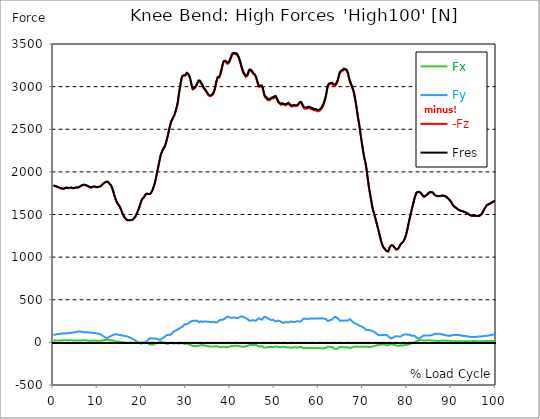
| Category |  Fx |  Fy |  -Fz |  Fres |
|---|---|---|---|---|
| 0.0 | 22.389 | 87.048 | 1838.339 | 1840.763 |
| 0.167348456675344 | 22.09 | 88.895 | 1835.905 | 1838.435 |
| 0.334696913350688 | 21.994 | 90.4 | 1833.695 | 1836.321 |
| 0.5020453700260321 | 22.731 | 91.98 | 1831.431 | 1834.164 |
| 0.669393826701376 | 23.66 | 94.436 | 1827.748 | 1830.577 |
| 0.83674228337672 | 22.891 | 95.995 | 1822.954 | 1825.815 |
| 1.0040907400520642 | 22.357 | 97.308 | 1819.302 | 1822.196 |
| 1.1621420602454444 | 21.919 | 98.504 | 1816.121 | 1819.067 |
| 1.3294905169207885 | 22.165 | 99.369 | 1813.622 | 1816.612 |
| 1.4968389735961325 | 22.656 | 99.849 | 1810.206 | 1813.227 |
| 1.6641874302714765 | 22.389 | 100.554 | 1805.348 | 1808.433 |
| 1.8315358869468206 | 24.407 | 101.291 | 1805.657 | 1808.818 |
| 1.9988843436221646 | 25.881 | 102.914 | 1804.035 | 1807.323 |
| 2.1662328002975086 | 24.813 | 104.942 | 1801.013 | 1804.408 |
| 2.333581256972853 | 23.233 | 106.693 | 1798.643 | 1802.113 |
| 2.5009297136481967 | 23.371 | 107.024 | 1802.732 | 1806.234 |
| 2.6682781703235405 | 25.816 | 104.921 | 1809.821 | 1813.238 |
| 2.8356266269988843 | 27.258 | 104.771 | 1813.206 | 1816.623 |
| 3.002975083674229 | 27.183 | 105.818 | 1812.854 | 1816.324 |
| 3.1703235403495724 | 26.276 | 106.373 | 1810.761 | 1814.231 |
| 3.337671997024917 | 23.948 | 107.59 | 1808.476 | 1811.967 |
| 3.4957233172182973 | 22.347 | 108.914 | 1807.643 | 1811.209 |
| 3.663071773893641 | 22.774 | 109.757 | 1810.259 | 1813.868 |
| 3.8304202305689854 | 24.877 | 110.238 | 1813.313 | 1816.964 |
| 3.997768687244329 | 25.763 | 111.989 | 1813.804 | 1817.541 |
| 4.165117143919673 | 25.304 | 113.484 | 1811.338 | 1815.16 |
| 4.332465600595017 | 23.745 | 114.167 | 1808.199 | 1812.042 |
| 4.499814057270361 | 21.759 | 116.292 | 1806.661 | 1810.611 |
| 4.667162513945706 | 21.161 | 117.744 | 1806.843 | 1810.868 |
| 4.834510970621049 | 21.087 | 118.939 | 1808.156 | 1812.234 |
| 5.001859427296393 | 21.919 | 119.729 | 1811.391 | 1815.501 |
| 5.169207883971737 | 23.243 | 122.078 | 1814.37 | 1818.651 |
| 5.336556340647081 | 23.852 | 124.491 | 1816.473 | 1820.904 |
| 5.503904797322425 | 22.571 | 126.947 | 1815.341 | 1819.932 |
| 5.671253253997769 | 20.724 | 129.018 | 1814.583 | 1819.292 |
| 5.82930457419115 | 19.656 | 129.968 | 1816.9 | 1821.673 |
| 5.996653030866494 | 20.692 | 128.805 | 1824.651 | 1829.339 |
| 6.164001487541838 | 22.464 | 126.071 | 1832.905 | 1837.389 |
| 6.331349944217181 | 23.254 | 124.715 | 1836.812 | 1841.2 |
| 6.498698400892526 | 23.094 | 124.427 | 1838.094 | 1842.46 |
| 6.66604685756787 | 24.461 | 122.046 | 1843.517 | 1847.735 |
| 6.833395314243213 | 25.176 | 120.231 | 1845.973 | 1850.062 |
| 7.000743770918558 | 24.247 | 118.181 | 1846.902 | 1850.852 |
| 7.168092227593902 | 23.884 | 117.776 | 1843.411 | 1847.34 |
| 7.335440684269246 | 24.108 | 117.519 | 1841.403 | 1845.332 |
| 7.50278914094459 | 23.756 | 117.349 | 1839.193 | 1843.112 |
| 7.6701375976199335 | 21.951 | 118.726 | 1834.164 | 1838.158 |
| 7.837486054295278 | 20.798 | 118.299 | 1830.235 | 1834.196 |
| 7.995537374488658 | 19.923 | 116.943 | 1825.623 | 1829.488 |
| 8.162885831164003 | 18.802 | 116.494 | 1820.295 | 1824.128 |
| 8.330234287839346 | 18.289 | 115.416 | 1817.242 | 1821.011 |
| 8.49758274451469 | 18.257 | 114.402 | 1815.373 | 1819.078 |
| 8.664931201190035 | 18.759 | 113.067 | 1817.135 | 1820.754 |
| 8.832279657865378 | 20.222 | 111.53 | 1821.278 | 1824.822 |
| 8.999628114540721 | 21.77 | 110.014 | 1824.491 | 1827.951 |
| 9.166976571216066 | 21.866 | 109.565 | 1825.698 | 1829.125 |
| 9.334325027891412 | 21.802 | 109.085 | 1826.242 | 1829.638 |
| 9.501673484566755 | 20.82 | 108.529 | 1823.733 | 1827.107 |
| 9.669021941242098 | 18.866 | 108.166 | 1819.409 | 1822.751 |
| 9.836370397917442 | 18.012 | 105.689 | 1819.366 | 1822.548 |
| 10.003718854592787 | 18.375 | 102.743 | 1820.231 | 1823.242 |
| 10.17106731126813 | 19.197 | 100.735 | 1822.185 | 1825.1 |
| 10.329118631461512 | 19.891 | 99.358 | 1824.598 | 1827.427 |
| 10.496467088136853 | 19.699 | 98.141 | 1823.167 | 1825.943 |
| 10.663815544812199 | 19.987 | 94.308 | 1828.217 | 1830.791 |
| 10.831164001487544 | 21.087 | 88.617 | 1838.777 | 1841.083 |
| 10.998512458162887 | 22.891 | 83.556 | 1847.446 | 1849.518 |
| 11.16586091483823 | 24.428 | 78.613 | 1853.884 | 1855.753 |
| 11.333209371513574 | 25.752 | 70.435 | 1863.451 | 1865.02 |
| 11.50055782818892 | 27.728 | 62.534 | 1873.145 | 1874.437 |
| 11.667906284864264 | 28.315 | 58.37 | 1876.199 | 1877.352 |
| 11.835254741539607 | 27.813 | 54.761 | 1879.231 | 1880.288 |
| 12.00260319821495 | 28.464 | 51.793 | 1883.801 | 1884.783 |
| 12.169951654890292 | 29.713 | 51.911 | 1885.221 | 1886.224 |
| 12.337300111565641 | 30.781 | 53.992 | 1882.765 | 1883.844 |
| 12.504648568240984 | 29.874 | 59.63 | 1873.412 | 1874.64 |
| 12.662699888434362 | 26.938 | 67.338 | 1860.888 | 1862.34 |
| 12.830048345109708 | 24.386 | 72.752 | 1849.71 | 1851.322 |
| 12.997396801785053 | 25.923 | 72.666 | 1843.432 | 1845.076 |
| 13.164745258460396 | 25.592 | 77.182 | 1826.84 | 1828.687 |
| 13.33209371513574 | 22.731 | 84.069 | 1803.234 | 1805.38 |
| 13.499442171811083 | 19.549 | 88.297 | 1775.88 | 1778.218 |
| 13.666790628486426 | 17.585 | 90.539 | 1744.213 | 1746.679 |
| 13.834139085161771 | 16.57 | 92.429 | 1715.086 | 1717.67 |
| 14.001487541837117 | 15.246 | 93.817 | 1688.512 | 1691.202 |
| 14.16883599851246 | 12.951 | 94.5 | 1665.61 | 1668.365 |
| 14.336184455187803 | 9.513 | 94.639 | 1645.41 | 1648.175 |
| 14.503532911863147 | 8.552 | 91.948 | 1628.989 | 1631.626 |
| 14.670881368538492 | 8.403 | 89.632 | 1616.465 | 1619.006 |
| 14.828932688731873 | 8.04 | 88.062 | 1605.18 | 1607.646 |
| 14.996281145407215 | 7.591 | 86.813 | 1592.004 | 1594.417 |
| 15.163629602082558 | 5.883 | 87.486 | 1571.121 | 1573.608 |
| 15.330978058757903 | 4.495 | 83.855 | 1549.895 | 1552.212 |
| 15.498326515433247 | 3.171 | 81.741 | 1528.905 | 1531.147 |
| 15.665674972108594 | 1.911 | 79.884 | 1507.978 | 1510.167 |
| 15.833023428783937 | 0.673 | 78.122 | 1488.098 | 1490.223 |
| 16.00037188545928 | -0.47 | 76.819 | 1473.118 | 1475.211 |
| 16.167720342134626 | -1.687 | 75.41 | 1459.1 | 1461.16 |
| 16.335068798809967 | -3.203 | 73.542 | 1449.224 | 1451.21 |
| 16.502417255485312 | -4.068 | 71.278 | 1440.928 | 1442.807 |
| 16.669765712160658 | -4.612 | 70.189 | 1435.931 | 1437.789 |
| 16.837114168836 | -4.377 | 68.193 | 1432.472 | 1434.244 |
| 17.004462625511344 | -3.481 | 64.627 | 1430.732 | 1432.333 |
| 17.16251394570472 | -3.139 | 59.406 | 1431.789 | 1433.177 |
| 17.32986240238007 | -2.648 | 54.921 | 1435.152 | 1436.348 |
| 17.497210859055414 | -2.915 | 51.761 | 1433.732 | 1434.81 |
| 17.664559315730756 | -2.723 | 47.907 | 1433.048 | 1433.999 |
| 17.8319077724061 | -3.086 | 44.277 | 1435.184 | 1436.017 |
| 17.999256229081443 | -3.427 | 38.757 | 1441.472 | 1442.188 |
| 18.166604685756788 | -3.449 | 33.418 | 1450.751 | 1451.359 |
| 18.333953142432133 | -3.673 | 28.817 | 1461.107 | 1461.619 |
| 18.501301599107478 | -4.057 | 24.535 | 1472.083 | 1472.51 |
| 18.668650055782823 | -3.139 | 17.083 | 1488.45 | 1488.792 |
| 18.835998512458165 | -2.541 | 9.801 | 1506.035 | 1506.323 |
| 19.00334696913351 | -1.836 | 2.989 | 1526.865 | 1527.164 |
| 19.170695425808855 | -1.537 | -1.004 | 1550.376 | 1550.675 |
| 19.338043882484197 | -3.331 | 0.256 | 1569.22 | 1569.487 |
| 19.496095202677576 | -1.196 | -7.164 | 1596.425 | 1596.606 |
| 19.66344365935292 | -0.224 | -11.563 | 1624.344 | 1624.537 |
| 19.830792116028263 | 0.427 | -14.093 | 1649.969 | 1650.171 |
| 19.998140572703612 | 0.48 | -13.132 | 1671.354 | 1671.557 |
| 20.165489029378953 | -1.602 | -8.755 | 1684.615 | 1684.807 |
| 20.3328374860543 | -4.943 | -2.029 | 1693.647 | 1693.872 |
| 20.500185942729644 | -7.997 | 4.014 | 1702.947 | 1703.235 |
| 20.667534399404985 | -5.787 | 1.431 | 1720.894 | 1721.097 |
| 20.83488285608033 | -4.933 | 2.808 | 1734.614 | 1734.753 |
| 21.002231312755672 | -5.669 | 10.954 | 1740.284 | 1740.486 |
| 21.16957976943102 | -5.584 | 16.346 | 1744.907 | 1745.141 |
| 21.336928226106362 | -8.456 | 24.909 | 1744.084 | 1744.437 |
| 21.504276682781704 | -13.73 | 34.71 | 1739.344 | 1739.899 |
| 21.67162513945705 | -19.154 | 43.027 | 1736.525 | 1737.283 |
| 21.82967645965043 | -23.222 | 47.341 | 1740.219 | 1741.127 |
| 21.997024916325774 | -25.101 | 48.003 | 1749.028 | 1749.989 |
| 22.16437337300112 | -26.308 | 48.344 | 1761.061 | 1762.075 |
| 22.33172182967646 | -25.56 | 46.732 | 1777.898 | 1778.944 |
| 22.499070286351806 | -24.685 | 45.771 | 1797.799 | 1798.888 |
| 22.666418743027148 | -22.432 | 46.978 | 1822.9 | 1824 |
| 22.833767199702496 | -19.731 | 48.216 | 1849.891 | 1850.991 |
| 23.00111565637784 | -16.111 | 46.391 | 1881.954 | 1882.947 |
| 23.168464113053183 | -11.734 | 43.39 | 1921.244 | 1922.056 |
| 23.335812569728528 | -8.531 | 41.447 | 1962.04 | 1962.734 |
| 23.50316102640387 | -5.477 | 40.294 | 2003.541 | 2004.171 |
| 23.670509483079215 | -1.879 | 38.073 | 2045.511 | 2046.035 |
| 23.83785793975456 | 4.58 | 30.279 | 2089.745 | 2090.098 |
| 23.995909259947936 | 5.894 | 31.571 | 2132.367 | 2132.741 |
| 24.163257716623285 | 6.983 | 31.23 | 2173.462 | 2173.814 |
| 24.330606173298627 | 7.057 | 34.518 | 2205.898 | 2206.314 |
| 24.49795462997397 | 5.595 | 41.212 | 2229.408 | 2229.985 |
| 24.665303086649313 | 3.748 | 48.441 | 2249.545 | 2250.345 |
| 24.83265154332466 | 0.972 | 56.235 | 2266.51 | 2267.588 |
| 25.0 | -3.897 | 59.971 | 2275.916 | 2277.112 |
| 25.167348456675345 | -7.89 | 65.918 | 2294.344 | 2295.732 |
| 25.334696913350694 | -11.317 | 73.061 | 2319.317 | 2320.962 |
| 25.502045370026035 | -14.424 | 80.599 | 2349.02 | 2350.899 |
| 25.669393826701377 | -16.229 | 85.863 | 2381.232 | 2383.303 |
| 25.836742283376722 | -15.887 | 87.603 | 2417.181 | 2419.37 |
| 26.004090740052067 | -14.723 | 88.265 | 2454.208 | 2456.461 |
| 26.17143919672741 | -12.257 | 86.77 | 2493.894 | 2496.146 |
| 26.329490516920792 | -9.011 | 87.261 | 2530.419 | 2532.682 |
| 26.49683897359613 | -6.086 | 89.77 | 2564.318 | 2566.613 |
| 26.66418743027148 | -6.865 | 97.191 | 2590.945 | 2593.455 |
| 26.831535886946828 | -9.022 | 107.27 | 2610.377 | 2613.271 |
| 26.998884343622166 | -10.463 | 115.523 | 2626.04 | 2629.126 |
| 27.166232800297514 | -11.488 | 123.157 | 2642.642 | 2645.952 |
| 27.333581256972852 | -12.513 | 130.791 | 2659.245 | 2662.768 |
| 27.5009297136482 | -12.033 | 135.691 | 2684.645 | 2688.328 |
| 27.668278170323543 | -10.848 | 139.396 | 2714.198 | 2717.989 |
| 27.835626626998888 | -9.481 | 142.738 | 2746.186 | 2750.072 |
| 28.002975083674233 | -10.314 | 149.112 | 2778.44 | 2782.626 |
| 28.170323540349575 | -11.595 | 151.546 | 2825.856 | 2830.127 |
| 28.33767199702492 | -14.584 | 157.899 | 2891.508 | 2896.013 |
| 28.50502045370026 | -14.734 | 163.942 | 2948.756 | 2953.444 |
| 28.663071773893645 | -12.364 | 169.686 | 2995.948 | 3000.859 |
| 28.830420230568986 | -10.367 | 174.96 | 3052.909 | 3057.991 |
| 28.99776868724433 | -8.734 | 179.092 | 3098.189 | 3103.41 |
| 29.165117143919673 | -7.944 | 183.555 | 3119.895 | 3125.34 |
| 29.33246560059502 | -8.979 | 190.751 | 3129.386 | 3135.259 |
| 29.499814057270367 | -12.396 | 200.435 | 3128.276 | 3134.767 |
| 29.66716251394571 | -18.738 | 212.649 | 3121.058 | 3128.404 |
| 29.834510970621054 | -18.076 | 214.005 | 3127.593 | 3135.013 |
| 30.00185942729639 | -16.154 | 213.258 | 3142.561 | 3149.886 |
| 30.169207883971744 | -14.414 | 213.269 | 3154.68 | 3161.972 |
| 30.33655634064708 | -14.403 | 216.781 | 3149.384 | 3156.922 |
| 30.50390479732243 | -17.414 | 222.867 | 3142.284 | 3150.291 |
| 30.671253253997772 | -21.492 | 229.07 | 3126.706 | 3135.227 |
| 30.829304574191156 | -25.411 | 234.195 | 3105.417 | 3114.407 |
| 30.996653030866494 | -30.941 | 242.171 | 3073.942 | 3083.775 |
| 31.164001487541842 | -34.369 | 246.794 | 3033.498 | 3043.972 |
| 31.331349944217187 | -37.476 | 250.04 | 2993.343 | 3004.34 |
| 31.498698400892525 | -40.155 | 252.41 | 2967.121 | 2978.459 |
| 31.666046857567874 | -41.896 | 252.954 | 2966.234 | 2977.552 |
| 31.833395314243212 | -41.469 | 251.566 | 2974.274 | 2985.41 |
| 32.00074377091856 | -42.867 | 255.047 | 2983.936 | 2995.329 |
| 32.1680922275939 | -46.113 | 257.033 | 2992.702 | 3004.201 |
| 32.33544068426925 | -46.658 | 255.175 | 3007.927 | 3019.191 |
| 32.50278914094459 | -45.739 | 252.175 | 3028.352 | 3039.264 |
| 32.670137597619934 | -42.963 | 246.933 | 3048.221 | 3058.589 |
| 32.83748605429528 | -38.97 | 241.199 | 3062.913 | 3072.725 |
| 33.004834510970625 | -35.5 | 237.879 | 3068.518 | 3078.01 |
| 33.162885831164004 | -34.518 | 241.957 | 3059.71 | 3069.554 |
| 33.33023428783935 | -34.838 | 246.463 | 3042.936 | 3053.218 |
| 33.497582744514695 | -33.045 | 246.111 | 3027.978 | 3038.271 |
| 33.664931201190036 | -30.226 | 242.491 | 3015.209 | 3025.234 |
| 33.83227965786538 | -31.315 | 243.206 | 2995.788 | 3005.963 |
| 33.99962811454073 | -35.073 | 244.541 | 2978.449 | 2988.848 |
| 34.16697657121607 | -36.237 | 244.306 | 2969.694 | 2980.125 |
| 34.33432502789141 | -38.148 | 244.872 | 2957.01 | 2967.537 |
| 34.50167348456676 | -40.219 | 244.787 | 2943.012 | 2953.593 |
| 34.6690219412421 | -42.077 | 243.836 | 2929.538 | 2940.108 |
| 34.83637039791744 | -43.924 | 242.907 | 2915.968 | 2926.538 |
| 35.00371885459279 | -45.771 | 242.299 | 2899.835 | 2910.459 |
| 35.17106731126814 | -47.031 | 240.932 | 2890.451 | 2900.999 |
| 35.338415767943474 | -47.213 | 239.438 | 2887.877 | 2898.309 |
| 35.49646708813686 | -47.074 | 237.964 | 2888.198 | 2898.512 |
| 35.6638155448122 | -47.063 | 236.213 | 2890.579 | 2900.754 |
| 35.831164001487544 | -47.779 | 238.028 | 2897.209 | 2907.533 |
| 35.998512458162885 | -49.241 | 241.936 | 2902.259 | 2912.904 |
| 36.165860914838234 | -49.562 | 242.149 | 2913.032 | 2923.666 |
| 36.333209371513576 | -47.907 | 238.359 | 2936.275 | 2946.504 |
| 36.50055782818892 | -46.508 | 236.202 | 2966.608 | 2976.559 |
| 36.667906284864266 | -44.49 | 233.362 | 3005.824 | 3015.412 |
| 36.83525474153961 | -44.042 | 231.547 | 3049.15 | 3058.492 |
| 37.002603198214956 | -44.576 | 234.537 | 3078.64 | 3088.11 |
| 37.1699516548903 | -47.448 | 241.797 | 3103.516 | 3113.51 |
| 37.337300111565646 | -50.886 | 249.025 | 3110.328 | 3120.952 |
| 37.50464856824098 | -54.9 | 257.641 | 3104.253 | 3115.72 |
| 37.66269988843437 | -56.993 | 261.336 | 3121.72 | 3133.454 |
| 37.83004834510971 | -57.142 | 262.991 | 3151.295 | 3163.05 |
| 37.99739680178505 | -55.594 | 263.962 | 3186.475 | 3198.145 |
| 38.16474525846039 | -52.252 | 263.77 | 3228.937 | 3240.35 |
| 38.33209371513574 | -51.281 | 264.656 | 3263.903 | 3275.253 |
| 38.49944217181109 | -51.152 | 269.429 | 3286.559 | 3298.208 |
| 38.666790628486424 | -52.06 | 277.34 | 3294.716 | 3307.037 |
| 38.83413908516178 | -54.195 | 283.212 | 3291.353 | 3304.24 |
| 39.001487541837115 | -54.911 | 288.113 | 3291.075 | 3304.411 |
| 39.16883599851246 | -56.939 | 295.651 | 3280.26 | 3294.364 |
| 39.336184455187805 | -58.007 | 301.769 | 3266.861 | 3281.627 |
| 39.503532911863154 | -55.487 | 300.733 | 3271.943 | 3286.549 |
| 39.670881368538495 | -53 | 297.893 | 3277.313 | 3291.588 |
| 39.83822982521384 | -49.69 | 292.608 | 3291.705 | 3305.361 |
| 39.996281145407224 | -47.117 | 290.75 | 3314.415 | 3327.804 |
| 40.163629602082565 | -44.618 | 289.213 | 3337.285 | 3350.428 |
| 40.33097805875791 | -41.992 | 287.686 | 3362.343 | 3375.262 |
| 40.498326515433256 | -41.757 | 290.27 | 3376.928 | 3389.996 |
| 40.6656749721086 | -41.81 | 291.53 | 3382.213 | 3395.366 |
| 40.83302342878393 | -41.234 | 291.551 | 3383.003 | 3396.156 |
| 41.00037188545929 | -39.696 | 289.907 | 3383.27 | 3396.263 |
| 41.16772034213463 | -39.504 | 289.01 | 3380.227 | 3393.156 |
| 41.33506879880997 | -38.682 | 287.526 | 3378.251 | 3391.042 |
| 41.50241725548531 | -38.084 | 286.266 | 3375.379 | 3388.063 |
| 41.66976571216066 | -38.458 | 286.917 | 3366.934 | 3379.725 |
| 41.837114168836 | -40.625 | 291.7 | 3344.353 | 3357.677 |
| 42.004462625511344 | -42.013 | 293.366 | 3321.003 | 3334.583 |
| 42.17181108218669 | -44.277 | 296.836 | 3294.332 | 3308.372 |
| 42.32986240238007 | -47.341 | 301.544 | 3264.277 | 3278.915 |
| 42.497210859055414 | -50.704 | 304.438 | 3231.371 | 3246.457 |
| 42.66455931573076 | -51.857 | 304.619 | 3202.074 | 3217.342 |
| 42.831907772406105 | -50.864 | 301.149 | 3176.45 | 3191.515 |
| 42.999256229081446 | -49.882 | 297.679 | 3150.815 | 3165.677 |
| 43.16660468575679 | -47.64 | 291.7 | 3139.145 | 3153.505 |
| 43.33395314243214 | -47.309 | 289.394 | 3126.674 | 3140.875 |
| 43.50130159910748 | -47.287 | 287.761 | 3114.482 | 3128.586 |
| 43.66865005578282 | -43.914 | 280.863 | 3121.197 | 3134.597 |
| 43.83599851245817 | -43.209 | 279.636 | 3124.656 | 3137.949 |
| 44.00334696913351 | -38.928 | 271.617 | 3142.348 | 3154.765 |
| 44.17069542580886 | -31.86 | 258.047 | 3173.097 | 3184.212 |
| 44.3380438824842 | -28.913 | 252.89 | 3189.945 | 3200.558 |
| 44.49609520267758 | -29.254 | 253.723 | 3190.895 | 3201.583 |
| 44.66344365935292 | -29.895 | 254.801 | 3187.479 | 3198.273 |
| 44.83079211602827 | -30.738 | 257.556 | 3178.019 | 3189.07 |
| 44.99814057270361 | -31.101 | 258.73 | 3166.2 | 3177.4 |
| 45.16548902937895 | -32.682 | 262.425 | 3149.192 | 3160.776 |
| 45.332837486054295 | -29.863 | 258.271 | 3140.373 | 3151.594 |
| 45.500185942729644 | -27.14 | 252.517 | 3136.241 | 3146.918 |
| 45.66753439940499 | -27.002 | 252.559 | 3124.795 | 3135.483 |
| 45.83488285608033 | -28.785 | 256.285 | 3104.381 | 3115.442 |
| 46.00223131275568 | -34.337 | 263.257 | 3074.454 | 3086.241 |
| 46.16957976943102 | -39.91 | 272.557 | 3042.424 | 3055.204 |
| 46.336928226106366 | -45.59 | 279.379 | 3013.415 | 3027.007 |
| 46.50427668278171 | -49.284 | 282.935 | 2995.168 | 3009.219 |
| 46.671625139457056 | -49.209 | 280.885 | 2990.545 | 3004.415 |
| 46.829676459650436 | -45.099 | 272.119 | 3000.005 | 3012.924 |
| 46.99702491632577 | -42.953 | 267.582 | 3004.735 | 3017.152 |
| 47.16437337300112 | -43.433 | 266.994 | 3001.126 | 3013.49 |
| 47.33172182967646 | -48.793 | 275.322 | 2976.879 | 2990.193 |
| 47.49907028635181 | -55.167 | 287.398 | 2938.699 | 2953.604 |
| 47.66641874302716 | -61.488 | 299.815 | 2897.636 | 2914.26 |
| 47.83376719970249 | -63.036 | 301.555 | 2877.809 | 2894.764 |
| 48.001115656377834 | -61.466 | 297.797 | 2866.631 | 2883.233 |
| 48.16846411305319 | -58.114 | 290.505 | 2860.545 | 2876.411 |
| 48.33581256972853 | -56.16 | 284.931 | 2852.569 | 2867.869 |
| 48.50316102640387 | -57.847 | 285.209 | 2839.287 | 2854.683 |
| 48.67050948307921 | -55.242 | 276.582 | 2835.743 | 2850.124 |
| 48.837857939754564 | -53.01 | 269.567 | 2839.159 | 2852.772 |
| 49.005206396429905 | -54.121 | 268.03 | 2841.967 | 2855.441 |
| 49.163257716623285 | -55.017 | 266.129 | 2850.295 | 2863.588 |
| 49.33060617329863 | -53.459 | 260.823 | 2858.741 | 2871.425 |
| 49.49795462997397 | -53.854 | 260.407 | 2862.456 | 2875.055 |
| 49.66530308664932 | -57.324 | 266.226 | 2856.242 | 2869.439 |
| 49.832651543324666 | -56.117 | 261.923 | 2862.093 | 2874.841 |
| 50.0 | -51.622 | 253.712 | 2876.122 | 2888.059 |
| 50.16734845667534 | -47.832 | 248.107 | 2887.877 | 2899.259 |
| 50.33469691335069 | -47.618 | 246.783 | 2875.535 | 2886.82 |
| 50.50204537002604 | -49.455 | 249.249 | 2856.968 | 2868.499 |
| 50.66939382670139 | -52.925 | 253.04 | 2835.284 | 2847.199 |
| 50.836742283376715 | -56.352 | 255.784 | 2815.82 | 2828.055 |
| 51.00409074005207 | -56.608 | 252.292 | 2807.097 | 2819.055 |
| 51.17143919672741 | -56.309 | 249.1 | 2799.794 | 2811.485 |
| 51.32949051692079 | -56.459 | 246.281 | 2792.149 | 2803.616 |
| 51.496838973596134 | -56.203 | 242.737 | 2786.437 | 2797.616 |
| 51.66418743027148 | -54.003 | 236.064 | 2789.203 | 2799.762 |
| 51.831535886946824 | -51.345 | 229.22 | 2795.16 | 2805.09 |
| 51.99888434362217 | -51.024 | 228.003 | 2793.826 | 2803.648 |
| 52.16623280029752 | -53.266 | 231.195 | 2786.993 | 2797.125 |
| 52.33358125697285 | -56.181 | 234.793 | 2781.131 | 2791.637 |
| 52.5009297136482 | -57.975 | 237.281 | 2780.811 | 2791.573 |
| 52.668278170323546 | -59.149 | 238.028 | 2782.839 | 2793.676 |
| 52.835626626998895 | -58.616 | 234.964 | 2790.548 | 2801.107 |
| 53.00297508367424 | -57.345 | 232.434 | 2798.449 | 2808.763 |
| 53.17032354034958 | -57.345 | 233.266 | 2800.104 | 2810.503 |
| 53.33767199702492 | -58.573 | 237.42 | 2792.47 | 2803.264 |
| 53.50502045370027 | -61.541 | 242.897 | 2779.337 | 2790.687 |
| 53.663071773893655 | -63.634 | 245.897 | 2768.532 | 2780.202 |
| 53.83042023056899 | -62.918 | 244.541 | 2767.39 | 2778.921 |
| 53.99776868724433 | -60.89 | 242.043 | 2768.938 | 2780.213 |
| 54.16511714391967 | -58.829 | 239.587 | 2770.454 | 2781.462 |
| 54.33246560059503 | -57.548 | 238.402 | 2771.96 | 2782.839 |
| 54.49981405727037 | -57.462 | 239.096 | 2773.454 | 2784.398 |
| 54.667162513945705 | -57.377 | 239.79 | 2774.96 | 2785.946 |
| 54.834510970621054 | -59.555 | 244.904 | 2769.322 | 2780.832 |
| 55.0018594272964 | -60.633 | 246.837 | 2769.707 | 2781.398 |
| 55.169207883971744 | -60.58 | 247.605 | 2773.956 | 2785.701 |
| 55.336556340647086 | -60.367 | 248.299 | 2778.686 | 2790.484 |
| 55.50390479732243 | -58.295 | 245.673 | 2790.943 | 2802.431 |
| 55.671253253997776 | -55.402 | 242.427 | 2805.869 | 2816.952 |
| 55.83860171067312 | -53.501 | 243.068 | 2815.137 | 2826.23 |
| 55.9966530308665 | -54.195 | 248.246 | 2810.578 | 2822.151 |
| 56.16400148754184 | -57.388 | 257.108 | 2795.363 | 2807.855 |
| 56.33134994421718 | -61.787 | 266.418 | 2775.547 | 2789.107 |
| 56.498698400892536 | -64.958 | 273.849 | 2759.916 | 2774.447 |
| 56.66604685756788 | -68.043 | 281.034 | 2744.627 | 2760.108 |
| 56.83339531424321 | -67.798 | 278.547 | 2742.022 | 2757.279 |
| 57.00074377091856 | -67.541 | 276.059 | 2739.406 | 2754.45 |
| 57.16809222759391 | -67.349 | 275.173 | 2740.378 | 2755.336 |
| 57.33544068426925 | -67.178 | 275.247 | 2743.463 | 2758.421 |
| 57.5027891409446 | -66.986 | 275.461 | 2746.442 | 2761.4 |
| 57.670137597619934 | -66.719 | 276.144 | 2749.026 | 2764.027 |
| 57.83748605429528 | -66.452 | 276.828 | 2751.62 | 2766.653 |
| 58.004834510970625 | -67.189 | 278.098 | 2746.133 | 2761.315 |
| 58.16288583116401 | -67.648 | 279.006 | 2740.655 | 2755.977 |
| 58.330234287839346 | -67.541 | 279.262 | 2736.897 | 2752.304 |
| 58.497582744514695 | -67.296 | 278.653 | 2732.936 | 2748.3 |
| 58.66493120119004 | -67.05 | 278.045 | 2728.975 | 2744.296 |
| 58.832279657865385 | -68 | 279.23 | 2725.462 | 2740.944 |
| 58.999628114540734 | -68.278 | 280.906 | 2723.017 | 2738.68 |
| 59.16697657121607 | -67.904 | 281.472 | 2722.537 | 2738.253 |
| 59.33432502789142 | -66.975 | 280.415 | 2722.483 | 2738.061 |
| 59.50167348456676 | -67.338 | 280.212 | 2716.088 | 2731.687 |
| 59.66902194124211 | -67.701 | 279.999 | 2709.703 | 2725.313 |
| 59.83637039791745 | -67.712 | 279.636 | 2710.365 | 2725.932 |
| 60.00371885459278 | -67.712 | 279.262 | 2711.476 | 2727 |
| 60.17106731126813 | -68.054 | 279.347 | 2714.113 | 2729.648 |
| 60.33841576794349 | -69.517 | 280.928 | 2721.576 | 2737.281 |
| 60.49646708813685 | -70.979 | 282.508 | 2729.039 | 2744.905 |
| 60.6638155448122 | -70.648 | 281.888 | 2743.271 | 2759.009 |
| 60.831164001487544 | -69.42 | 280.532 | 2759.105 | 2774.618 |
| 60.99851245816289 | -69.591 | 280.629 | 2773.155 | 2788.626 |
| 61.16586091483824 | -68.321 | 279.091 | 2798.822 | 2814.005 |
| 61.333209371513576 | -66.634 | 277.095 | 2827.799 | 2842.629 |
| 61.50055782818892 | -65.62 | 276.71 | 2854.352 | 2869.022 |
| 61.667906284864266 | -63.142 | 271.938 | 2893.493 | 2907.459 |
| 61.835254741539615 | -57.815 | 261.421 | 2944.144 | 2956.764 |
| 62.002603198214956 | -52.786 | 251.823 | 2990.599 | 3001.98 |
| 62.16995165489029 | -51.227 | 250.819 | 3013.031 | 3024.209 |
| 62.33730011156564 | -51.227 | 253.253 | 3024.999 | 3036.338 |
| 62.504648568240995 | -52.263 | 257.738 | 3029.687 | 3041.399 |
| 62.67199702491633 | -53.512 | 262.094 | 3030.455 | 3042.52 |
| 62.83004834510971 | -54.195 | 264.443 | 3032.025 | 3044.26 |
| 62.99739680178505 | -54.964 | 266.514 | 3034.662 | 3047.036 |
| 63.1647452584604 | -58.829 | 273.048 | 3030.914 | 3043.908 |
| 63.33209371513575 | -68.086 | 288.722 | 3015.412 | 3030.028 |
| 63.4994421718111 | -74.577 | 299.825 | 3003.283 | 3019.213 |
| 63.666790628486424 | -75.848 | 300.519 | 3004.479 | 3020.558 |
| 63.83413908516177 | -75.378 | 296.398 | 3014.953 | 3030.594 |
| 64.00148754183712 | -74.503 | 292.181 | 3028.106 | 3043.278 |
| 64.16883599851248 | -74.011 | 288.412 | 3046.855 | 3061.557 |
| 64.3361844551878 | -71.641 | 281.963 | 3071.689 | 3085.611 |
| 64.50353291186315 | -64.701 | 270.966 | 3106.186 | 3118.774 |
| 64.6708813685385 | -55.562 | 258.656 | 3144.184 | 3155.374 |
| 64.83822982521384 | -51.782 | 253.264 | 3165.452 | 3176.055 |
| 65.00557828188919 | -54.323 | 252.207 | 3174.581 | 3185.13 |
| 65.16362960208257 | -54.761 | 252.1 | 3182.386 | 3192.924 |
| 65.3309780587579 | -57.537 | 256.979 | 3181.062 | 3192.048 |
| 65.49832651543326 | -59.128 | 258.207 | 3187.596 | 3198.711 |
| 65.6656749721086 | -57.196 | 253.958 | 3201.38 | 3212.099 |
| 65.83302342878395 | -57.377 | 255.111 | 3203.398 | 3214.203 |
| 66.00037188545929 | -59.544 | 257.492 | 3195.038 | 3206.131 |
| 66.16772034213463 | -59.085 | 256.392 | 3189.988 | 3201.038 |
| 66.33506879880998 | -57.505 | 253.36 | 3186.827 | 3197.654 |
| 66.50241725548531 | -57.954 | 254.502 | 3166.712 | 3177.72 |
| 66.66976571216065 | -59.961 | 259.211 | 3139.113 | 3150.676 |
| 66.83711416883601 | -65.47 | 270.048 | 3096.085 | 3109.036 |
| 67.00446262551135 | -67.531 | 271.681 | 3063.372 | 3076.76 |
| 67.1718110821867 | -66.175 | 266.823 | 3040.086 | 3053.239 |
| 67.32986240238007 | -61.915 | 257.257 | 3020.312 | 3032.729 |
| 67.49721085905541 | -59.192 | 249.922 | 2996.588 | 3008.376 |
| 67.66455931573076 | -55.423 | 241.167 | 2972.801 | 2983.755 |
| 67.83190777240611 | -51.654 | 232.423 | 2949.002 | 2959.134 |
| 67.99925622908145 | -50.021 | 226.593 | 2912.327 | 2922.043 |
| 68.16660468575678 | -49.957 | 222.995 | 2866.641 | 2876.229 |
| 68.33395314243214 | -49.583 | 219.354 | 2819.621 | 2829.08 |
| 68.50130159910749 | -49.423 | 215.532 | 2768.127 | 2777.469 |
| 68.66865005578282 | -51.024 | 213.183 | 2707.312 | 2716.665 |
| 68.83599851245816 | -51.75 | 208.849 | 2649.326 | 2658.497 |
| 69.00334696913352 | -50.64 | 202.09 | 2596.423 | 2605.188 |
| 69.17069542580886 | -49.636 | 195.983 | 2543.477 | 2551.9 |
| 69.3380438824842 | -49.935 | 191.723 | 2484.701 | 2492.954 |
| 69.50539233915956 | -51.11 | 189.289 | 2423.213 | 2431.456 |
| 69.66344365935292 | -52.54 | 187.805 | 2363.744 | 2372.061 |
| 69.83079211602826 | -52.209 | 182.285 | 2307.84 | 2315.88 |
| 69.99814057270362 | -52.455 | 177.523 | 2251.712 | 2259.56 |
| 70.16548902937896 | -53.085 | 173.113 | 2198.072 | 2205.749 |
| 70.33283748605429 | -51.836 | 165.586 | 2153.614 | 2160.863 |
| 70.50018594272964 | -49.423 | 156.212 | 2120.281 | 2126.943 |
| 70.667534399405 | -48.013 | 147.607 | 2075.567 | 2081.695 |
| 70.83488285608033 | -48.804 | 144.04 | 2017.602 | 2023.667 |
| 71.00223131275568 | -51.483 | 144.66 | 1952.004 | 1958.442 |
| 71.16957976943102 | -54.185 | 146.443 | 1884.399 | 1891.413 |
| 71.33692822610637 | -55.551 | 146.453 | 1821.555 | 1828.944 |
| 71.50427668278171 | -54.622 | 143.229 | 1768.129 | 1775.453 |
| 71.67162513945706 | -52.989 | 139.375 | 1718.225 | 1725.389 |
| 71.8389735961324 | -51.953 | 137.335 | 1669.08 | 1676.201 |
| 71.99702491632577 | -51.12 | 136.097 | 1619.155 | 1626.245 |
| 72.16437337300113 | -49.775 | 134.218 | 1573.299 | 1580.303 |
| 72.33172182967647 | -47.17 | 130.331 | 1538.727 | 1545.443 |
| 72.49907028635181 | -44.095 | 123.989 | 1509.355 | 1515.601 |
| 72.66641874302715 | -41.042 | 117.21 | 1479.439 | 1485.226 |
| 72.8337671997025 | -38.33 | 110.825 | 1448.54 | 1453.9 |
| 73.00111565637783 | -37.08 | 106.042 | 1413.104 | 1418.208 |
| 73.16846411305319 | -34.23 | 98.483 | 1380.732 | 1385.28 |
| 73.33581256972853 | -31.39 | 90.923 | 1348.35 | 1352.353 |
| 73.50316102640387 | -28.582 | 84.208 | 1315.294 | 1318.818 |
| 73.67050948307921 | -27.439 | 82.649 | 1278.961 | 1282.495 |
| 73.83785793975457 | -27.322 | 83.311 | 1242.777 | 1246.514 |
| 74.00520639642991 | -26.542 | 84.347 | 1208.345 | 1212.295 |
| 74.16325771662328 | -25.347 | 85.35 | 1174.713 | 1178.845 |
| 74.33060617329863 | -24.898 | 87.859 | 1148.555 | 1152.964 |
| 74.49795462997398 | -24.226 | 89.055 | 1126.336 | 1130.917 |
| 74.66530308664932 | -24.13 | 87.058 | 1109.702 | 1114.186 |
| 74.83265154332466 | -25.582 | 86.386 | 1098.588 | 1102.986 |
| 75.00000000000001 | -27.589 | 87.176 | 1089.192 | 1093.58 |
| 75.16734845667534 | -30.269 | 86.695 | 1079.722 | 1084.067 |
| 75.3346969133507 | -33.707 | 84.784 | 1070.187 | 1074.447 |
| 75.50204537002605 | -35.5 | 81.603 | 1063.642 | 1067.668 |
| 75.66939382670138 | -33.354 | 75.389 | 1064.326 | 1067.785 |
| 75.83674228337672 | -28.785 | 65.182 | 1081.483 | 1083.992 |
| 76.00409074005208 | -23.745 | 55.509 | 1104.171 | 1105.912 |
| 76.17143919672742 | -20.553 | 48.419 | 1124.724 | 1126.016 |
| 76.33878765340276 | -19.741 | 45.782 | 1136.234 | 1137.376 |
| 76.49683897359614 | -22.016 | 47.757 | 1139.981 | 1141.252 |
| 76.66418743027148 | -25.4 | 51.686 | 1136.586 | 1138.124 |
| 76.83153588694682 | -26.019 | 55.893 | 1130.308 | 1132.059 |
| 76.99888434362218 | -26.713 | 61.925 | 1120.08 | 1122.162 |
| 77.16623280029752 | -30.109 | 67.488 | 1108.303 | 1110.834 |
| 77.33358125697285 | -33.867 | 71.321 | 1097.904 | 1100.808 |
| 77.5009297136482 | -34.87 | 71.737 | 1089.822 | 1092.822 |
| 77.66827817032356 | -37.23 | 71.46 | 1088.018 | 1091.103 |
| 77.83562662699889 | -39.184 | 71.31 | 1091.626 | 1094.776 |
| 78.00297508367423 | -40.006 | 70.435 | 1099.634 | 1102.773 |
| 78.17032354034959 | -39.824 | 68.684 | 1112.756 | 1115.777 |
| 78.33767199702493 | -36.963 | 66.132 | 1131.376 | 1134.205 |
| 78.50502045370027 | -32.372 | 66.036 | 1149.548 | 1152.228 |
| 78.67236891037561 | -33.867 | 72.453 | 1156.872 | 1159.872 |
| 78.83042023056899 | -35.404 | 79.521 | 1163.598 | 1167.047 |
| 78.99776868724433 | -36.942 | 86.589 | 1170.325 | 1174.233 |
| 79.16511714391969 | -34.39 | 88.212 | 1184.781 | 1188.7 |
| 79.33246560059503 | -31.998 | 90.283 | 1200.626 | 1204.597 |
| 79.49981405727036 | -30.792 | 93.198 | 1220.943 | 1225.075 |
| 79.66716251394571 | -31.101 | 95.845 | 1245.65 | 1249.942 |
| 79.83451097062107 | -31.518 | 95.888 | 1277.029 | 1281.31 |
| 80.00185942729641 | -29.158 | 91.564 | 1312.86 | 1316.693 |
| 80.16920788397174 | -26.179 | 88.788 | 1353.111 | 1356.496 |
| 80.33655634064709 | -22.806 | 88.148 | 1395.851 | 1398.957 |
| 80.50390479732243 | -21.268 | 90.966 | 1436.006 | 1439.145 |
| 80.67125325399778 | -18.631 | 88.265 | 1472.617 | 1475.51 |
| 80.83860171067312 | -15.14 | 82.83 | 1510.722 | 1513.231 |
| 80.99665303086651 | -10.986 | 78.368 | 1549.949 | 1552.095 |
| 81.16400148754184 | -6.972 | 78.079 | 1586.484 | 1588.588 |
| 81.3313499442172 | -2.797 | 76.713 | 1621.237 | 1623.266 |
| 81.49869840089255 | 0.854 | 76.168 | 1655.158 | 1657.154 |
| 81.66604685756786 | 4.004 | 76.36 | 1688.33 | 1690.327 |
| 81.83339531424322 | 7.709 | 69.143 | 1717.008 | 1718.674 |
| 82.00074377091858 | 11.595 | 60.132 | 1743.444 | 1744.725 |
| 82.16809222759392 | 15.94 | 51.964 | 1758.028 | 1759.053 |
| 82.33544068426926 | 19.41 | 47.928 | 1763.74 | 1764.648 |
| 82.50278914094459 | 21.866 | 46.722 | 1765.79 | 1766.644 |
| 82.67013759761994 | 23.831 | 47.138 | 1764.819 | 1765.684 |
| 82.83748605429528 | 25.122 | 49.423 | 1761.733 | 1762.662 |
| 83.00483451097062 | 26.244 | 53.501 | 1756.555 | 1757.633 |
| 83.17218296764597 | 26.083 | 59.694 | 1747.416 | 1748.729 |
| 83.33023428783935 | 24.845 | 67.189 | 1734.988 | 1736.621 |
| 83.4975827445147 | 22.496 | 74.855 | 1720.361 | 1722.314 |
| 83.66493120119004 | 20.798 | 79.777 | 1710.816 | 1712.994 |
| 83.83227965786537 | 20.062 | 81.144 | 1707.965 | 1710.175 |
| 83.99962811454073 | 20.98 | 81.272 | 1711.488 | 1713.677 |
| 84.16697657121607 | 22.176 | 80.001 | 1719.047 | 1721.151 |
| 84.33432502789142 | 23.169 | 79.969 | 1724.856 | 1726.948 |
| 84.50167348456677 | 24.055 | 79.873 | 1731.806 | 1733.899 |
| 84.6690219412421 | 24.503 | 79.702 | 1739.867 | 1741.949 |
| 84.83637039791745 | 25.24 | 79.051 | 1750.095 | 1752.135 |
| 85.0037188545928 | 25.603 | 79.19 | 1758.156 | 1760.185 |
| 85.17106731126813 | 25.368 | 80.61 | 1762.769 | 1764.851 |
| 85.33841576794349 | 23.777 | 83.556 | 1761.253 | 1763.463 |
| 85.50576422461883 | 22.304 | 86.493 | 1760.121 | 1762.459 |
| 85.66381554481221 | 21.375 | 88.596 | 1759.459 | 1761.883 |
| 85.83116400148755 | 20.969 | 91.03 | 1754.281 | 1756.865 |
| 85.99851245816289 | 20.2 | 94.618 | 1742.921 | 1745.761 |
| 86.16586091483823 | 19.368 | 98.301 | 1730.696 | 1733.813 |
| 86.33320937151358 | 19.165 | 100.319 | 1724.204 | 1727.471 |
| 86.50055782818893 | 18.3 | 100.607 | 1720.307 | 1723.585 |
| 86.66790628486427 | 17.382 | 100.853 | 1716.378 | 1719.667 |
| 86.83525474153961 | 16.592 | 101.269 | 1712.994 | 1716.303 |
| 87.00260319821496 | 16.464 | 102.326 | 1712.406 | 1715.791 |
| 87.16995165489031 | 16.677 | 102.679 | 1712.994 | 1716.421 |
| 87.33730011156564 | 17.222 | 101.59 | 1713.592 | 1716.987 |
| 87.504648568241 | 18.236 | 99.006 | 1716.058 | 1719.346 |
| 87.67199702491634 | 19.208 | 96.411 | 1718.086 | 1721.268 |
| 87.83004834510972 | 19.998 | 93.742 | 1719.368 | 1722.464 |
| 87.99739680178506 | 20.926 | 90.795 | 1720.553 | 1723.542 |
| 88.1647452584604 | 20.862 | 90.646 | 1719.432 | 1722.432 |
| 88.33209371513574 | 20.467 | 89.813 | 1716.581 | 1719.592 |
| 88.49944217181108 | 20.638 | 86.941 | 1715.182 | 1718.161 |
| 88.66679062848644 | 20.596 | 84.154 | 1712.001 | 1714.98 |
| 88.83413908516178 | 20.297 | 81.261 | 1706.78 | 1709.812 |
| 89.00148754183712 | 19.869 | 80.321 | 1699.263 | 1702.349 |
| 89.16883599851246 | 19.784 | 78.901 | 1689.985 | 1693.156 |
| 89.33618445518782 | 19.41 | 78.165 | 1681.796 | 1684.999 |
| 89.50353291186315 | 19.037 | 77.428 | 1673.618 | 1676.853 |
| 89.6708813685385 | 18.311 | 76.104 | 1663.464 | 1666.731 |
| 89.83822982521386 | 17.2 | 77.225 | 1652.552 | 1655.894 |
| 90.00557828188919 | 15.631 | 80.514 | 1639.815 | 1643.2 |
| 90.16362960208257 | 13.656 | 84.229 | 1623.447 | 1626.811 |
| 90.3309780587579 | 12.353 | 86.194 | 1609.29 | 1612.675 |
| 90.49832651543326 | 11.851 | 87.731 | 1597.994 | 1601.411 |
| 90.66567497210859 | 12.449 | 87.603 | 1590.04 | 1593.424 |
| 90.83302342878395 | 12.769 | 87.197 | 1582.47 | 1585.812 |
| 91.00037188545929 | 13.229 | 86.407 | 1577.73 | 1581.018 |
| 91.16772034213463 | 13.293 | 85.286 | 1572.626 | 1575.84 |
| 91.33506879880998 | 12.908 | 85.062 | 1563.754 | 1566.957 |
| 91.50241725548533 | 12.716 | 85.596 | 1557.358 | 1560.583 |
| 91.66976571216065 | 12.609 | 85.478 | 1551.924 | 1555.137 |
| 91.83711416883601 | 12.332 | 84.475 | 1548.219 | 1551.347 |
| 92.00446262551137 | 12.47 | 83.161 | 1544.493 | 1547.536 |
| 92.1718110821867 | 12.62 | 81.848 | 1540.766 | 1543.724 |
| 92.33915953886203 | 13.335 | 79.777 | 1539.699 | 1542.517 |
| 92.49721085905541 | 13.666 | 77.855 | 1536.645 | 1539.304 |
| 92.66455931573077 | 14.008 | 76.008 | 1535.279 | 1537.756 |
| 92.83190777240611 | 13.826 | 75.496 | 1532.268 | 1534.681 |
| 92.99925622908145 | 12.93 | 75.784 | 1527.463 | 1529.833 |
| 93.1666046857568 | 13.079 | 75.197 | 1523.609 | 1525.904 |
| 93.33395314243214 | 13.656 | 73.883 | 1519.851 | 1522.093 |
| 93.50130159910749 | 13.933 | 71.951 | 1515.9 | 1518.046 |
| 93.66865005578283 | 13.933 | 69.869 | 1510.177 | 1512.259 |
| 93.83599851245818 | 13.89 | 67.776 | 1504.209 | 1506.216 |
| 94.00334696913353 | 13.848 | 65.94 | 1498.412 | 1500.366 |
| 94.17069542580886 | 13.752 | 65.278 | 1493.458 | 1495.401 |
| 94.3380438824842 | 13.645 | 64.616 | 1488.514 | 1490.425 |
| 94.50539233915954 | 13.805 | 63.986 | 1485.354 | 1487.254 |
| 94.66344365935292 | 14.286 | 63.335 | 1484.372 | 1486.251 |
| 94.83079211602828 | 14.99 | 62.416 | 1484.585 | 1486.464 |
| 94.99814057270362 | 15.695 | 61.498 | 1484.799 | 1486.678 |
| 95.16548902937897 | 15.812 | 61.509 | 1484.596 | 1486.507 |
| 95.33283748605432 | 15.161 | 62.715 | 1483.849 | 1485.824 |
| 95.50018594272963 | 14.478 | 63.847 | 1483.069 | 1485.076 |
| 95.66753439940499 | 13.794 | 64.979 | 1482.29 | 1484.34 |
| 95.83488285608034 | 13.56 | 65.983 | 1481.617 | 1483.699 |
| 96.00223131275567 | 13.495 | 66.954 | 1480.987 | 1483.101 |
| 96.16957976943102 | 13.421 | 67.936 | 1480.485 | 1482.631 |
| 96.33692822610638 | 13.527 | 69.314 | 1483.475 | 1485.685 |
| 96.50427668278171 | 13.923 | 69.634 | 1489.016 | 1491.216 |
| 96.67162513945706 | 14.243 | 69.452 | 1495.283 | 1497.451 |
| 96.8389735961324 | 13.944 | 70.211 | 1505.298 | 1507.466 |
| 96.99702491632577 | 13.677 | 71.075 | 1516.285 | 1518.463 |
| 97.16437337300111 | 13.634 | 72.773 | 1534.318 | 1536.528 |
| 97.33172182967647 | 13.602 | 74.481 | 1552.351 | 1554.593 |
| 97.49907028635181 | 14.339 | 75.293 | 1567.704 | 1569.967 |
| 97.66641874302715 | 14.499 | 76.2 | 1576.993 | 1579.299 |
| 97.8337671997025 | 15.577 | 76.243 | 1592.859 | 1595.165 |
| 98.00111565637785 | 16.602 | 76.659 | 1608.746 | 1611.062 |
| 98.16846411305319 | 16.613 | 78.474 | 1612.312 | 1614.66 |
| 98.33581256972855 | 16.517 | 80.407 | 1616.294 | 1618.675 |
| 98.50316102640389 | 16.368 | 82.863 | 1619.775 | 1622.241 |
| 98.67050948307921 | 16.912 | 84.539 | 1624.718 | 1627.259 |
| 98.83785793975456 | 17.734 | 85.767 | 1631.049 | 1633.633 |
| 99.0052063964299 | 17.574 | 86.866 | 1634.786 | 1637.423 |
| 99.17255485310525 | 17.083 | 87.891 | 1638.811 | 1641.491 |
| 99.33060617329863 | 17.019 | 88.254 | 1644.801 | 1647.502 |
| 99.49795462997399 | 16.912 | 88.692 | 1650.62 | 1653.342 |
| 99.66530308664933 | 16.175 | 90.144 | 1653.77 | 1656.567 |
| 99.83265154332467 | 16.004 | 90.112 | 1656.439 | 1659.236 |
| 100.0 | 15.834 | 90.091 | 1659.108 | 1661.905 |